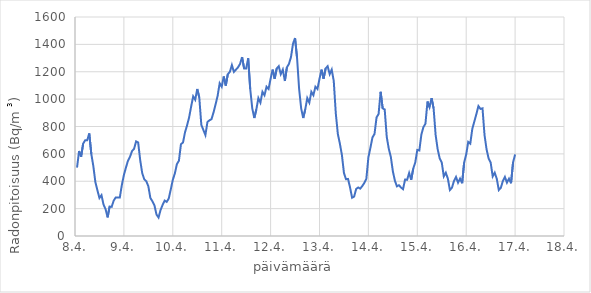
| Category | Series 0 |
|---|---|
| 43929.041666666635 | 500.032 |
| 43929.0833333333 | 620.672 |
| 43929.12499999996 | 579.072 |
| 43929.16666666663 | 674.752 |
| 43929.20833333329 | 699.712 |
| 43929.249999999956 | 699.712 |
| 43929.29166666662 | 749.632 |
| 43929.333333333285 | 599.872 |
| 43929.37499999995 | 510.432 |
| 43929.41666666661 | 393.952 |
| 43929.45833333328 | 333.632 |
| 43929.49999999994 | 277.472 |
| 43929.541666666606 | 298.272 |
| 43929.58333333327 | 229.632 |
| 43929.624999999935 | 196.352 |
| 43929.6666666666 | 136.032 |
| 43929.70833333326 | 215.072 |
| 43929.74999999993 | 212.992 |
| 43929.79166666659 | 258.752 |
| 43929.833333333256 | 281.632 |
| 43929.87499999992 | 281.632 |
| 43929.916666666584 | 281.632 |
| 43929.95833333325 | 373.152 |
| 43929.99999999991 | 445.952 |
| 43930.04166666658 | 500.032 |
| 43930.08333333324 | 549.952 |
| 43930.124999999905 | 579.072 |
| 43930.16666666657 | 620.672 |
| 43930.208333333234 | 637.312 |
| 43930.2499999999 | 691.392 |
| 43930.29166666656 | 683.072 |
| 43930.33333333323 | 554.112 |
| 43930.37499999989 | 458.432 |
| 43930.416666666555 | 414.752 |
| 43930.45833333322 | 400.192 |
| 43930.49999999988 | 362.752 |
| 43930.54166666655 | 277.472 |
| 43930.58333333321 | 253.552 |
| 43930.624999999876 | 223.392 |
| 43930.66666666654 | 156.832 |
| 43930.708333333205 | 134.992 |
| 43930.74999999987 | 190.112 |
| 43930.79166666653 | 227.552 |
| 43930.8333333332 | 258.752 |
| 43930.87499999986 | 249.392 |
| 43930.916666666526 | 273.312 |
| 43930.95833333319 | 339.872 |
| 43930.999999999854 | 410.592 |
| 43931.04166666652 | 456.352 |
| 43931.08333333318 | 524.992 |
| 43931.12499999985 | 549.952 |
| 43931.16666666651 | 670.592 |
| 43931.208333333176 | 683.072 |
| 43931.24999999984 | 757.952 |
| 43931.291666666504 | 807.872 |
| 43931.33333333317 | 866.112 |
| 43931.37499999983 | 945.152 |
| 43931.4166666665 | 1020.032 |
| 43931.45833333316 | 995.072 |
| 43931.499999999825 | 1074.112 |
| 43931.54166666649 | 1011.712 |
| 43931.583333333154 | 812.032 |
| 43931.62499999982 | 774.592 |
| 43931.66666666648 | 737.152 |
| 43931.70833333315 | 832.832 |
| 43931.74999999981 | 845.312 |
| 43931.791666666475 | 853.632 |
| 43931.83333333314 | 903.552 |
| 43931.8749999998 | 961.792 |
| 43931.91666666647 | 1024.192 |
| 43931.95833333313 | 1115.712 |
| 43931.999999999796 | 1090.752 |
| 43932.04166666646 | 1165.632 |
| 43932.083333333125 | 1099.072 |
| 43932.12499999979 | 1182.272 |
| 43932.16666666645 | 1198.912 |
| 43932.20833333312 | 1248.832 |
| 43932.24999999978 | 1198.912 |
| 43932.291666666446 | 1215.552 |
| 43932.33333333311 | 1232.192 |
| 43932.374999999774 | 1257.152 |
| 43932.41666666644 | 1307.072 |
| 43932.4583333331 | 1223.872 |
| 43932.49999999977 | 1223.872 |
| 43932.54166666643 | 1298.752 |
| 43932.583333333096 | 1074.112 |
| 43932.62499999976 | 932.672 |
| 43932.666666666424 | 861.952 |
| 43932.70833333309 | 924.352 |
| 43932.74999999975 | 1007.552 |
| 43932.79166666642 | 974.272 |
| 43932.83333333308 | 1053.312 |
| 43932.874999999745 | 1028.352 |
| 43932.91666666641 | 1090.752 |
| 43932.958333333074 | 1074.112 |
| 43932.99999999974 | 1148.992 |
| 43933.0416666664 | 1215.552 |
| 43933.08333333307 | 1148.992 |
| 43933.12499999973 | 1223.872 |
| 43933.166666666395 | 1240.512 |
| 43933.20833333306 | 1182.272 |
| 43933.24999999972 | 1215.552 |
| 43933.29166666639 | 1132.352 |
| 43933.33333333305 | 1232.192 |
| 43933.374999999716 | 1257.152 |
| 43933.41666666638 | 1307.072 |
| 43933.458333333045 | 1404.832 |
| 43933.49999999971 | 1446.432 |
| 43933.54166666637 | 1298.752 |
| 43933.58333333304 | 1074.112 |
| 43933.6249999997 | 932.672 |
| 43933.666666666366 | 861.952 |
| 43933.70833333303 | 924.352 |
| 43933.749999999694 | 1007.552 |
| 43933.79166666636 | 974.272 |
| 43933.83333333302 | 1053.312 |
| 43933.87499999969 | 1028.352 |
| 43933.91666666635 | 1090.752 |
| 43933.958333333016 | 1074.112 |
| 43933.99999999968 | 1148.992 |
| 43934.041666666344 | 1215.552 |
| 43934.08333333301 | 1148.992 |
| 43934.12499999967 | 1223.872 |
| 43934.16666666634 | 1240.512 |
| 43934.208333333 | 1182.272 |
| 43934.249999999665 | 1215.552 |
| 43934.29166666633 | 1132.352 |
| 43934.333333332994 | 895.232 |
| 43934.37499999966 | 745.472 |
| 43934.41666666632 | 674.752 |
| 43934.45833333299 | 591.552 |
| 43934.49999999965 | 460.512 |
| 43934.541666666315 | 414.752 |
| 43934.58333333298 | 416.832 |
| 43934.62499999964 | 354.432 |
| 43934.66666666631 | 279.552 |
| 43934.70833333297 | 287.872 |
| 43934.749999999636 | 344.032 |
| 43934.7916666663 | 354.432 |
| 43934.833333332965 | 346.112 |
| 43934.87499999963 | 364.832 |
| 43934.91666666629 | 387.712 |
| 43934.95833333296 | 418.912 |
| 43934.99999999962 | 574.912 |
| 43935.041666666286 | 645.632 |
| 43935.08333333295 | 720.512 |
| 43935.124999999614 | 745.472 |
| 43935.16666666628 | 866.112 |
| 43935.20833333294 | 891.072 |
| 43935.24999999961 | 1053.312 |
| 43935.29166666627 | 932.672 |
| 43935.333333332936 | 924.352 |
| 43935.3749999996 | 724.672 |
| 43935.416666666264 | 637.312 |
| 43935.45833333293 | 579.072 |
| 43935.49999999959 | 472.992 |
| 43935.54166666626 | 404.352 |
| 43935.58333333292 | 362.752 |
| 43935.624999999585 | 371.072 |
| 43935.66666666625 | 354.432 |
| 43935.708333332914 | 341.952 |
| 43935.74999999958 | 412.672 |
| 43935.79166666624 | 410.592 |
| 43935.83333333291 | 460.512 |
| 43935.87499999957 | 410.592 |
| 43935.916666666235 | 491.712 |
| 43935.9583333329 | 537.472 |
| 43935.99999999956 | 628.992 |
| 43936.04166666623 | 624.832 |
| 43936.08333333289 | 741.312 |
| 43936.124999999556 | 795.392 |
| 43936.16666666622 | 820.352 |
| 43936.208333332885 | 982.592 |
| 43936.24999999955 | 940.992 |
| 43936.29166666621 | 1007.552 |
| 43936.33333333288 | 932.672 |
| 43936.37499999954 | 737.152 |
| 43936.416666666206 | 633.152 |
| 43936.45833333287 | 566.592 |
| 43936.499999999534 | 537.472 |
| 43936.5416666662 | 435.552 |
| 43936.58333333286 | 462.592 |
| 43936.62499999953 | 418.912 |
| 43936.66666666619 | 335.712 |
| 43936.708333332856 | 352.352 |
| 43936.74999999952 | 402.272 |
| 43936.791666666184 | 431.392 |
| 43936.83333333285 | 389.792 |
| 43936.87499999951 | 418.912 |
| 43936.91666666618 | 385.632 |
| 43936.95833333284 | 537.472 |
| 43936.999999999505 | 595.712 |
| 43937.04166666617 | 687.232 |
| 43937.083333332834 | 674.752 |
| 43937.1249999995 | 782.912 |
| 43937.16666666616 | 836.992 |
| 43937.20833333283 | 891.072 |
| 43937.24999999949 | 949.312 |
| 43937.291666666155 | 928.512 |
| 43937.33333333282 | 932.672 |
| 43937.37499999948 | 737.152 |
| 43937.41666666615 | 633.152 |
| 43937.45833333281 | 566.592 |
| 43937.499999999476 | 537.472 |
| 43937.54166666614 | 435.552 |
| 43937.583333332805 | 462.592 |
| 43937.62499999947 | 418.912 |
| 43937.66666666613 | 335.712 |
| 43937.7083333328 | 352.352 |
| 43937.74999999946 | 402.272 |
| 43937.791666666126 | 431.392 |
| 43937.83333333279 | 389.792 |
| 43937.874999999454 | 418.912 |
| 43937.91666666612 | 385.632 |
| 43937.95833333278 | 537.472 |
| 43937.99999999945 | 595.712 |